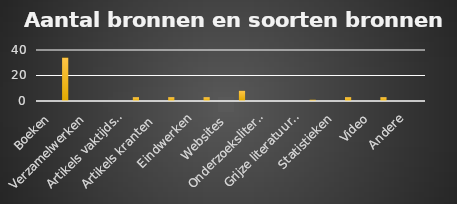
| Category | Series 0 | Series 1 | Series 2 | Series 3 |
|---|---|---|---|---|
| Boeken |  |  |  | 34 |
| Verzamelwerken |  |  |  | 0 |
| Artikels vaktijdschriften |  |  |  | 3 |
| Artikels kranten  |  |  |  | 3 |
| Eindwerken |  |  |  | 3 |
| Websites  |  |  |  | 8 |
| Onderzoeksliteratuur  |  |  |  | 0 |
| Grijze literatuur (folders, rapporten)  |  |  |  | 1 |
| Statistieken |  |  |  | 3 |
| Video |  |  |  | 3 |
| Andere |  |  |  | 0 |